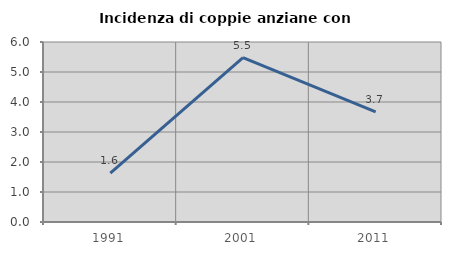
| Category | Incidenza di coppie anziane con figli |
|---|---|
| 1991.0 | 1.626 |
| 2001.0 | 5.476 |
| 2011.0 | 3.672 |